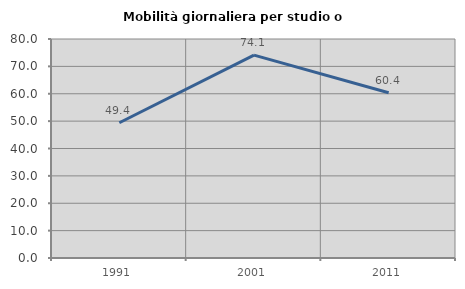
| Category | Mobilità giornaliera per studio o lavoro |
|---|---|
| 1991.0 | 49.405 |
| 2001.0 | 74.128 |
| 2011.0 | 60.386 |